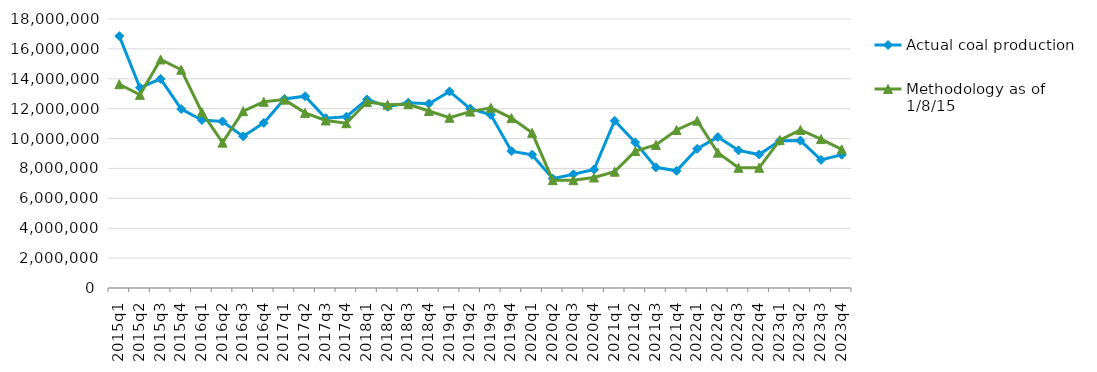
| Category | Actual coal production | Methodology as of 1/8/15 |
|---|---|---|
| 2015q1 | 16857304 | 13635893 |
| 2015q2 | 13402745 | 12923034 |
| 2015q3 | 13990764 | 15293240 |
| 2015q4 | 11976363 | 14602487 |
| 2016q1 | 11236640 | 11768725 |
| 2016q2 | 11143979 | 9727174 |
| 2016q3 | 10147845 | 11830428 |
| 2016q4 | 11046783 | 12459043 |
| 2017q1 | 12650454 | 12604662 |
| 2017q2 | 12833809 | 11717849 |
| 2017q3 | 11360740 | 11211183 |
| 2017q4 | 11458332 | 11027318 |
| 2018q1 | 12622006 | 12445708 |
| 2018q2 | 12126994 | 12268158 |
| 2018q3 | 12400051 | 12293629 |
| 2018q4 | 12332814 | 11845350 |
| 2019q1 | 13151538 | 11392211 |
| 2019q2 | 12001927 | 11802630 |
| 2019q3 | 11584096 | 12057405 |
| 2019q4 | 9157856 | 11369192 |
| 2020q1 | 8913371 | 10384080 |
| 2020q2 | 7318484 | 7214602 |
| 2020q3 | 7607262 | 7214602 |
| 2020q4 | 7930195 | 7393344 |
| 2021q1 | 11191667 | 7784573 |
| 2021q2 | 9740747 | 9161071 |
| 2021q3 | 8074305 | 9572414 |
| 2021q4 | 7840890 | 10574712 |
| 2022q1 | 9314742 | 11193308 |
| 2022q2 | 10098604 | 9054255 |
| 2022q3 | 9211124 | 8041203 |
| 2022q4 | 8929180 | 8044222 |
| 2023q1 | 9848241 | 9898520 |
| 2023q2 | 9864405 | 10573954 |
| 2023q3 | 8568355 | 9964802 |
| 2023q4 | 8916782 | 9279900 |